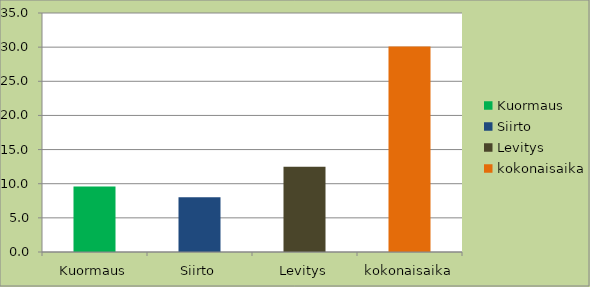
| Category | Series 0 |
|---|---|
| Kuormaus | 9.583 |
| Siirto | 8 |
| Levitys | 12.5 |
| kokonaisaika | 30.083 |